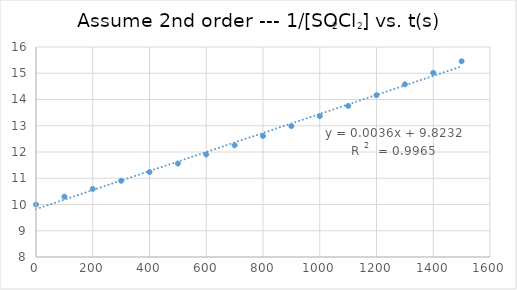
| Category | 1/[] |
|---|---|
| 0.0 | 10 |
| 100.0 | 10.299 |
| 200.0 | 10.593 |
| 300.0 | 10.905 |
| 400.0 | 11.236 |
| 500.0 | 11.561 |
| 600.0 | 11.905 |
| 700.0 | 12.255 |
| 800.0 | 12.61 |
| 900.0 | 12.987 |
| 1000.0 | 13.369 |
| 1100.0 | 13.755 |
| 1200.0 | 14.164 |
| 1300.0 | 14.577 |
| 1400.0 | 15.015 |
| 1500.0 | 15.456 |